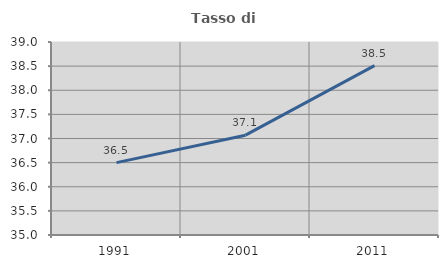
| Category | Tasso di occupazione   |
|---|---|
| 1991.0 | 36.5 |
| 2001.0 | 37.069 |
| 2011.0 | 38.51 |